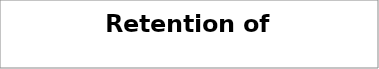
| Category | Retention of Business Program Students |
|---|---|
| 2013.0 | 81 |
| 2014.0 | 83 |
| 2015.0 | 85 |